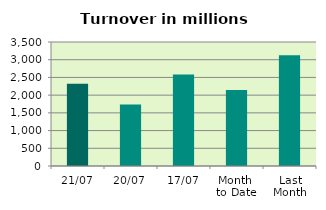
| Category | Series 0 |
|---|---|
| 21/07 | 2321.548 |
| 20/07 | 1736.853 |
| 17/07 | 2581.673 |
| Month 
to Date | 2146.607 |
| Last
Month | 3125.17 |